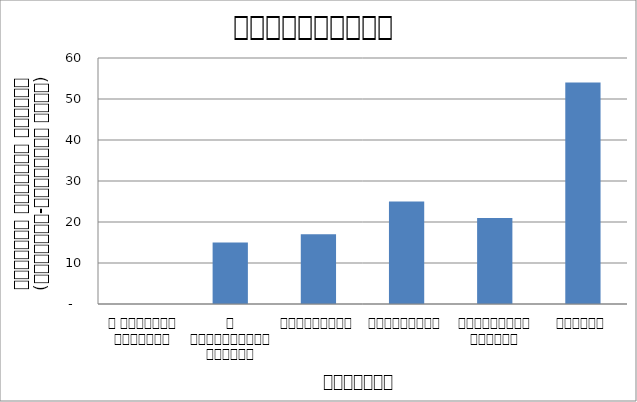
| Category | भ्रष्टाचार |
|---|---|
| द हिमालयन टाइम्स् | 0 |
| द काठमाण्डौं पोस्ट् | 15 |
| रिपब्लिका | 17 |
| कान्तिपुर | 25 |
| अन्नपूर्ण पोस्ट् | 21 |
| नागरिक | 54 |